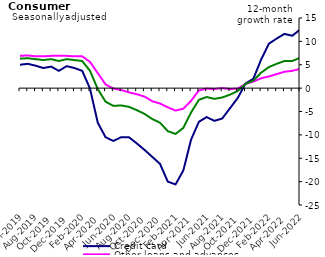
| Category | Credit card | Other loans and advances | Total |
|---|---|---|---|
| Jun-2019 | 5 | 6.9 | 6.3 |
| Jul-2019 | 5.2 | 7 | 6.4 |
| Aug-2019 | 4.8 | 6.8 | 6.2 |
| Sep-2019 | 4.3 | 6.8 | 6 |
| Oct-2019 | 4.6 | 6.9 | 6.2 |
| Nov-2019 | 3.7 | 6.9 | 5.8 |
| Dec-2019 | 4.7 | 6.9 | 6.2 |
| Jan-2020 | 4.3 | 6.8 | 6 |
| Feb-2020 | 3.7 | 6.8 | 5.8 |
| Mar-2020 | -0.1 | 5.6 | 3.7 |
| Apr-2020 | -7.4 | 3.2 | -0.2 |
| May-2020 | -10.5 | 0.8 | -2.9 |
| Jun-2020 | -11.3 | -0.1 | -3.8 |
| Jul-2020 | -10.5 | -0.4 | -3.7 |
| Aug-2020 | -10.5 | -0.9 | -4 |
| Sep-2020 | -11.8 | -1.3 | -4.7 |
| Oct-2020 | -13.2 | -1.8 | -5.5 |
| Nov-2020 | -14.7 | -2.8 | -6.6 |
| Dec-2020 | -16.2 | -3.3 | -7.4 |
| Jan-2021 | -20 | -4.1 | -9.2 |
| Feb-2021 | -20.6 | -4.8 | -9.8 |
| Mar-2021 | -17.6 | -4.4 | -8.5 |
| Apr-2021 | -11 | -2.7 | -5.2 |
| May-2021 | -7.2 | -0.5 | -2.5 |
| Jun-2021 | -6.2 | -0.1 | -1.9 |
| Jul-2021 | -7 | -0.2 | -2.3 |
| Aug-2021 | -6.5 | 0 | -2 |
| Sep-2021 | -4.3 | -0.2 | -1.4 |
| Oct-2021 | -2.1 | -0.1 | -0.6 |
| Nov-2021 | 1 | 0.9 | 0.9 |
| Dec-2021 | 2 | 1.4 | 1.6 |
| Jan-2022 | 6.1 | 2.1 | 3.3 |
| Feb-2022 | 9.5 | 2.5 | 4.5 |
| Mar-2022 | 10.6 | 3 | 5.2 |
| Apr-2022 | 11.6 | 3.5 | 5.8 |
| May-2022 | 11.2 | 3.7 | 5.8 |
| Jun-2022 | 12.5 | 4.1 | 6.5 |